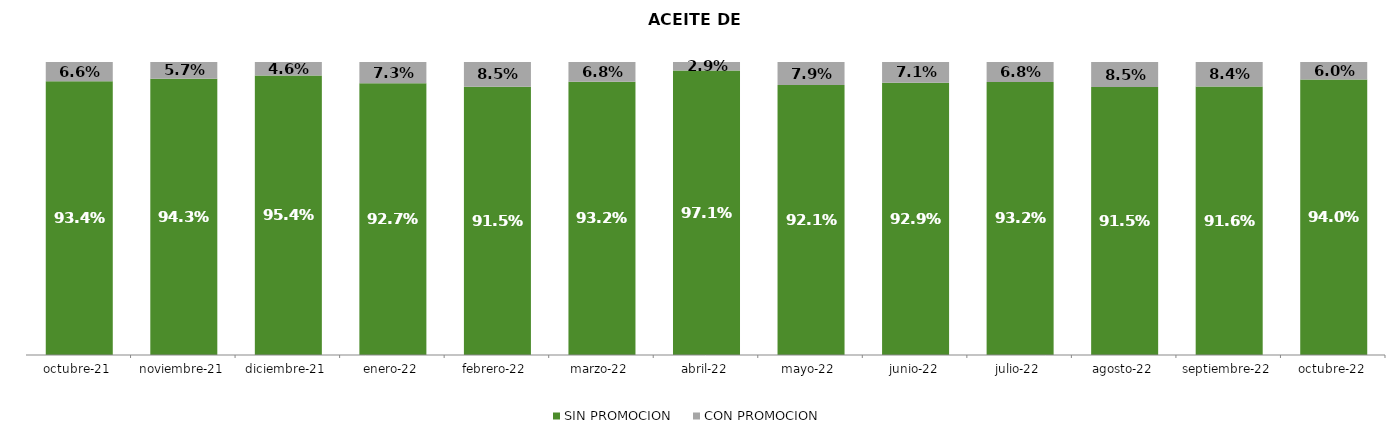
| Category | SIN PROMOCION   | CON PROMOCION   |
|---|---|---|
| 2021-10-01 | 0.934 | 0.066 |
| 2021-11-01 | 0.943 | 0.057 |
| 2021-12-01 | 0.954 | 0.046 |
| 2022-01-01 | 0.927 | 0.073 |
| 2022-02-01 | 0.915 | 0.085 |
| 2022-03-01 | 0.932 | 0.068 |
| 2022-04-01 | 0.971 | 0.029 |
| 2022-05-01 | 0.921 | 0.079 |
| 2022-06-01 | 0.929 | 0.071 |
| 2022-07-01 | 0.932 | 0.068 |
| 2022-08-01 | 0.915 | 0.085 |
| 2022-09-01 | 0.916 | 0.084 |
| 2022-10-01 | 0.94 | 0.06 |